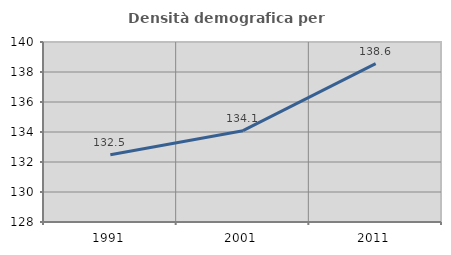
| Category | Densità demografica |
|---|---|
| 1991.0 | 132.485 |
| 2001.0 | 134.087 |
| 2011.0 | 138.56 |